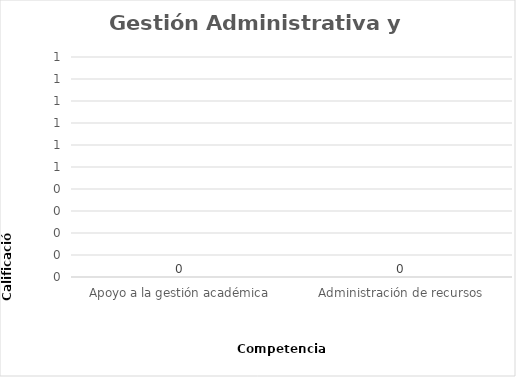
| Category | Series 0 |
|---|---|
| Apoyo a la gestión académica | 0 |
| Administración de recursos | 0 |